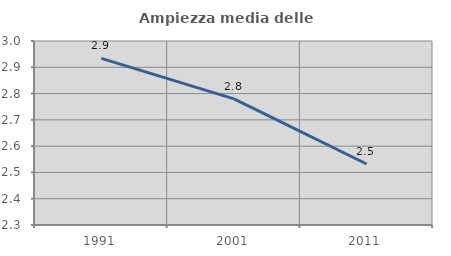
| Category | Ampiezza media delle famiglie |
|---|---|
| 1991.0 | 2.934 |
| 2001.0 | 2.78 |
| 2011.0 | 2.532 |